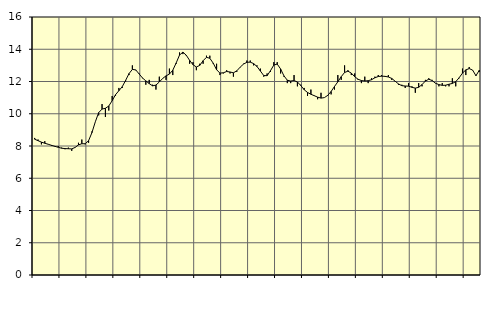
| Category | Piggar | Series 1 |
|---|---|---|
| nan | 8.5 | 8.42 |
| 87.0 | 8.4 | 8.33 |
| 87.0 | 8.1 | 8.24 |
| 87.0 | 8.3 | 8.17 |
| nan | 8.1 | 8.11 |
| 88.0 | 8 | 8.04 |
| 88.0 | 8 | 7.98 |
| 88.0 | 8 | 7.92 |
| nan | 7.9 | 7.86 |
| 89.0 | 7.8 | 7.84 |
| 89.0 | 7.9 | 7.83 |
| 89.0 | 7.7 | 7.82 |
| nan | 7.9 | 7.91 |
| 90.0 | 8.2 | 8.07 |
| 90.0 | 8.4 | 8.14 |
| 90.0 | 8.1 | 8.14 |
| nan | 8.2 | 8.33 |
| 91.0 | 8.9 | 8.83 |
| 91.0 | 9.5 | 9.5 |
| 91.0 | 9.9 | 10.07 |
| nan | 10.6 | 10.29 |
| 92.0 | 9.8 | 10.34 |
| 92.0 | 10.2 | 10.48 |
| 92.0 | 11.1 | 10.81 |
| nan | 11.1 | 11.18 |
| 93.0 | 11.6 | 11.43 |
| 93.0 | 11.6 | 11.68 |
| 93.0 | 12 | 12.07 |
| nan | 12.4 | 12.49 |
| 94.0 | 13 | 12.75 |
| 94.0 | 12.7 | 12.72 |
| 94.0 | 12.5 | 12.47 |
| nan | 12.2 | 12.22 |
| 95.0 | 11.8 | 12.04 |
| 95.0 | 12.1 | 11.87 |
| 95.0 | 11.8 | 11.73 |
| nan | 11.5 | 11.78 |
| 96.0 | 12.3 | 11.97 |
| 96.0 | 12.2 | 12.19 |
| 96.0 | 12.1 | 12.35 |
| nan | 12.8 | 12.46 |
| 97.0 | 12.4 | 12.7 |
| 97.0 | 13.1 | 13.15 |
| 97.0 | 13.8 | 13.64 |
| nan | 13.7 | 13.82 |
| 98.0 | 13.6 | 13.63 |
| 98.0 | 13.1 | 13.31 |
| 98.0 | 13.2 | 13.04 |
| nan | 12.7 | 12.9 |
| 99.0 | 13.1 | 13 |
| 99.0 | 13.1 | 13.29 |
| 99.0 | 13.6 | 13.5 |
| nan | 13.6 | 13.44 |
| 0.0 | 13.1 | 13.14 |
| 0.0 | 13.1 | 12.73 |
| 0.0 | 12.4 | 12.52 |
| nan | 12.5 | 12.54 |
| 1.0 | 12.7 | 12.62 |
| 1.0 | 12.5 | 12.59 |
| 1.0 | 12.3 | 12.54 |
| nan | 12.6 | 12.66 |
| 2.0 | 12.9 | 12.89 |
| 2.0 | 13.1 | 13.08 |
| 2.0 | 13.3 | 13.19 |
| nan | 13.3 | 13.2 |
| 3.0 | 13 | 13.11 |
| 3.0 | 13 | 12.93 |
| 3.0 | 12.8 | 12.65 |
| nan | 12.3 | 12.37 |
| 4.0 | 12.5 | 12.36 |
| 4.0 | 12.6 | 12.67 |
| 4.0 | 13.2 | 13.02 |
| nan | 13.2 | 13.08 |
| 5.0 | 12.5 | 12.78 |
| 5.0 | 12.3 | 12.35 |
| 5.0 | 11.9 | 12.08 |
| nan | 11.9 | 12.03 |
| 6.0 | 12.4 | 12.06 |
| 6.0 | 11.7 | 11.97 |
| 6.0 | 11.8 | 11.75 |
| nan | 11.6 | 11.49 |
| 7.0 | 11.1 | 11.32 |
| 7.0 | 11.5 | 11.21 |
| 7.0 | 11.1 | 11.12 |
| nan | 10.9 | 11.03 |
| 8.0 | 11.3 | 10.97 |
| 8.0 | 11 | 11 |
| 8.0 | 11.1 | 11.14 |
| nan | 11.2 | 11.38 |
| 9.0 | 11.5 | 11.69 |
| 9.0 | 12.4 | 11.98 |
| 9.0 | 12.1 | 12.3 |
| nan | 13 | 12.56 |
| 10.0 | 12.7 | 12.64 |
| 10.0 | 12.4 | 12.52 |
| 10.0 | 12.5 | 12.3 |
| nan | 12.1 | 12.14 |
| 11.0 | 11.9 | 12.06 |
| 11.0 | 12.3 | 12.03 |
| 11.0 | 11.9 | 12.05 |
| nan | 12.2 | 12.11 |
| 12.0 | 12.3 | 12.23 |
| 12.0 | 12.4 | 12.31 |
| 12.0 | 12.4 | 12.33 |
| nan | 12.3 | 12.32 |
| 13.0 | 12.4 | 12.28 |
| 13.0 | 12.1 | 12.19 |
| 13.0 | 12 | 12.02 |
| nan | 11.8 | 11.85 |
| 14.0 | 11.8 | 11.74 |
| 14.0 | 11.6 | 11.72 |
| 14.0 | 11.9 | 11.71 |
| nan | 11.7 | 11.64 |
| 15.0 | 11.3 | 11.59 |
| 15.0 | 11.9 | 11.64 |
| 15.0 | 11.7 | 11.81 |
| nan | 12.1 | 12.03 |
| 16.0 | 12.2 | 12.14 |
| 16.0 | 12.1 | 12.06 |
| 16.0 | 11.9 | 11.89 |
| nan | 11.7 | 11.81 |
| 17.0 | 11.9 | 11.76 |
| 17.0 | 11.7 | 11.77 |
| 17.0 | 11.7 | 11.83 |
| nan | 12.2 | 11.88 |
| 18.0 | 11.7 | 11.99 |
| 18.0 | 12.2 | 12.23 |
| 18.0 | 12.8 | 12.52 |
| nan | 12.4 | 12.72 |
| 19.0 | 12.9 | 12.8 |
| 19.0 | 12.7 | 12.71 |
| 19.0 | 12.4 | 12.36 |
| nan | 12.6 | 12.7 |